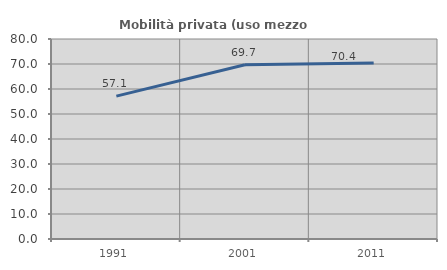
| Category | Mobilità privata (uso mezzo privato) |
|---|---|
| 1991.0 | 57.143 |
| 2001.0 | 69.69 |
| 2011.0 | 70.398 |